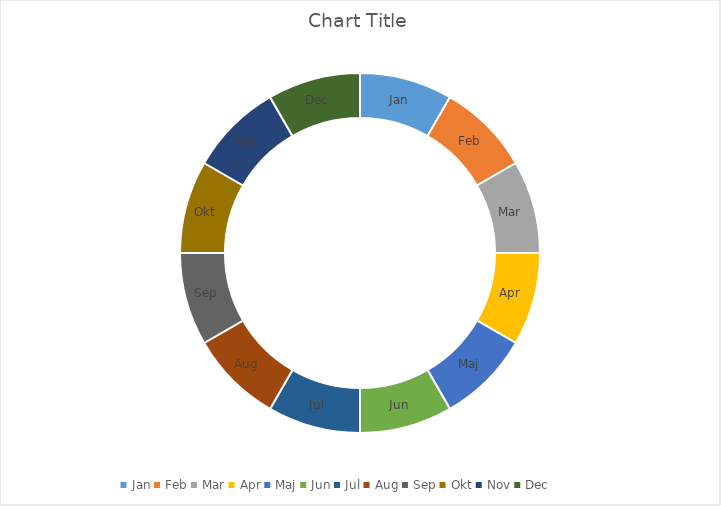
| Category | Series 0 |
|---|---|
| Jan | 1 |
| Feb | 1 |
| Mar | 1 |
| Apr | 1 |
| Maj | 1 |
| Jun | 1 |
| Jul | 1 |
| Aug | 1 |
| Sep | 1 |
| Okt | 1 |
| Nov | 1 |
| Dec | 1 |